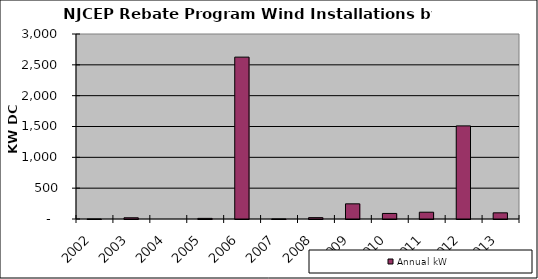
| Category | Annual kW |
|---|---|
| 2002.0 | 0.38 |
| 2003.0 | 20 |
| 2004.0 | 0 |
| 2005.0 | 10 |
| 2006.0 | 2625 |
| 2007.0 | 1 |
| 2008.0 | 21.8 |
| 2009.0 | 245.9 |
| 2010.0 | 90 |
| 2011.0 | 110 |
| 2012.0 | 1510 |
| 2013.0 | 100 |